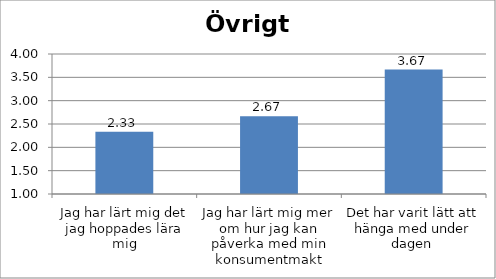
| Category | Series 0 |
|---|---|
| Jag har lärt mig det jag hoppades lära mig | 2.333 |
| Jag har lärt mig mer om hur jag kan påverka med min konsumentmakt | 2.667 |
| Det har varit lätt att hänga med under dagen  | 3.667 |